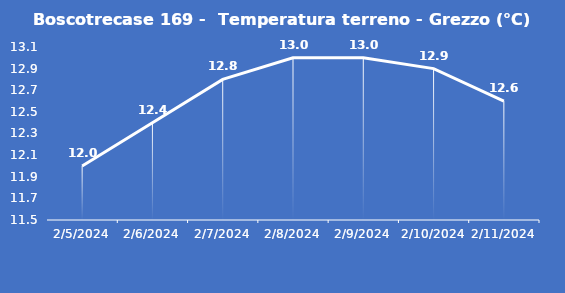
| Category | Boscotrecase 169 -  Temperatura terreno - Grezzo (°C) |
|---|---|
| 2/5/24 | 12 |
| 2/6/24 | 12.4 |
| 2/7/24 | 12.8 |
| 2/8/24 | 13 |
| 2/9/24 | 13 |
| 2/10/24 | 12.9 |
| 2/11/24 | 12.6 |